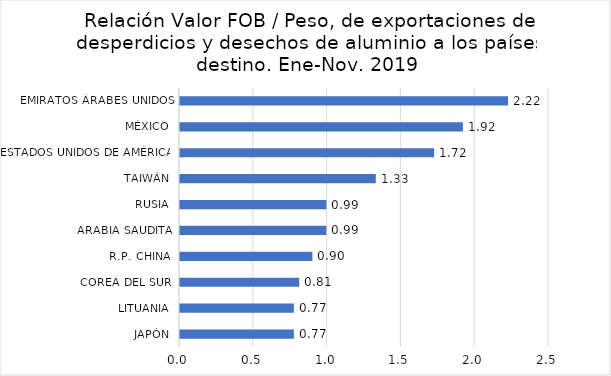
| Category | Series 0 |
|---|---|
| JAPÓN | 0.772 |
| LITUANIA | 0.772 |
| COREA DEL SUR | 0.807 |
| R.P. CHINA | 0.897 |
| ARABIA SAUDITA | 0.991 |
| RUSIA | 0.992 |
| TAIWÁN | 1.326 |
| ESTADOS UNIDOS DE AMÉRICA | 1.722 |
| MÉXICO | 1.917 |
| EMIRATOS ÁRABES UNIDOS | 2.222 |